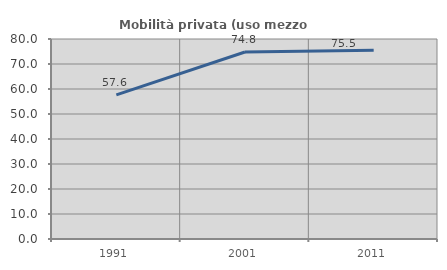
| Category | Mobilità privata (uso mezzo privato) |
|---|---|
| 1991.0 | 57.628 |
| 2001.0 | 74.799 |
| 2011.0 | 75.494 |